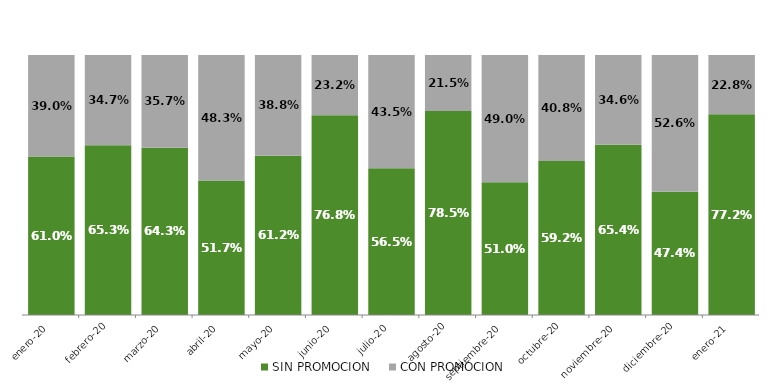
| Category | SIN PROMOCION   | CON PROMOCION   |
|---|---|---|
| 2020-01-01 | 0.61 | 0.39 |
| 2020-02-01 | 0.653 | 0.347 |
| 2020-03-01 | 0.643 | 0.357 |
| 2020-04-01 | 0.517 | 0.483 |
| 2020-05-01 | 0.612 | 0.388 |
| 2020-06-01 | 0.768 | 0.232 |
| 2020-07-01 | 0.565 | 0.435 |
| 2020-08-01 | 0.785 | 0.215 |
| 2020-09-01 | 0.51 | 0.49 |
| 2020-10-01 | 0.592 | 0.408 |
| 2020-11-01 | 0.654 | 0.346 |
| 2020-12-01 | 0.474 | 0.526 |
| 2021-01-01 | 0.772 | 0.228 |